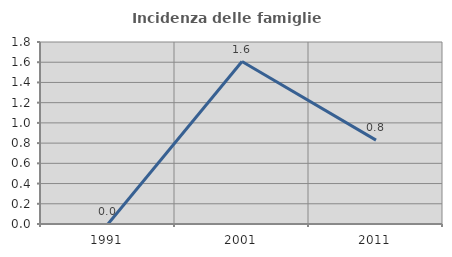
| Category | Incidenza delle famiglie numerose |
|---|---|
| 1991.0 | 0 |
| 2001.0 | 1.606 |
| 2011.0 | 0.83 |